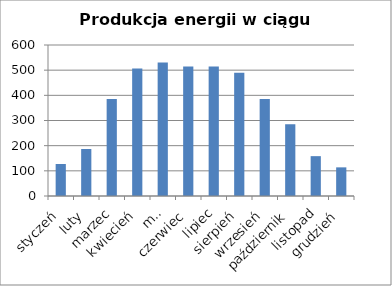
| Category | Miesiąc |
|---|---|
| styczeń | 127.17 |
| luty | 186.705 |
| marzec | 385.155 |
| kwiecień | 506.25 |
| maj | 530.55 |
| czerwiec | 514.35 |
| lipiec | 514.35 |
| sierpień | 490.05 |
| wrzesień | 385.56 |
| październik | 285.12 |
| listopad | 158.355 |
| grudzień | 113.805 |